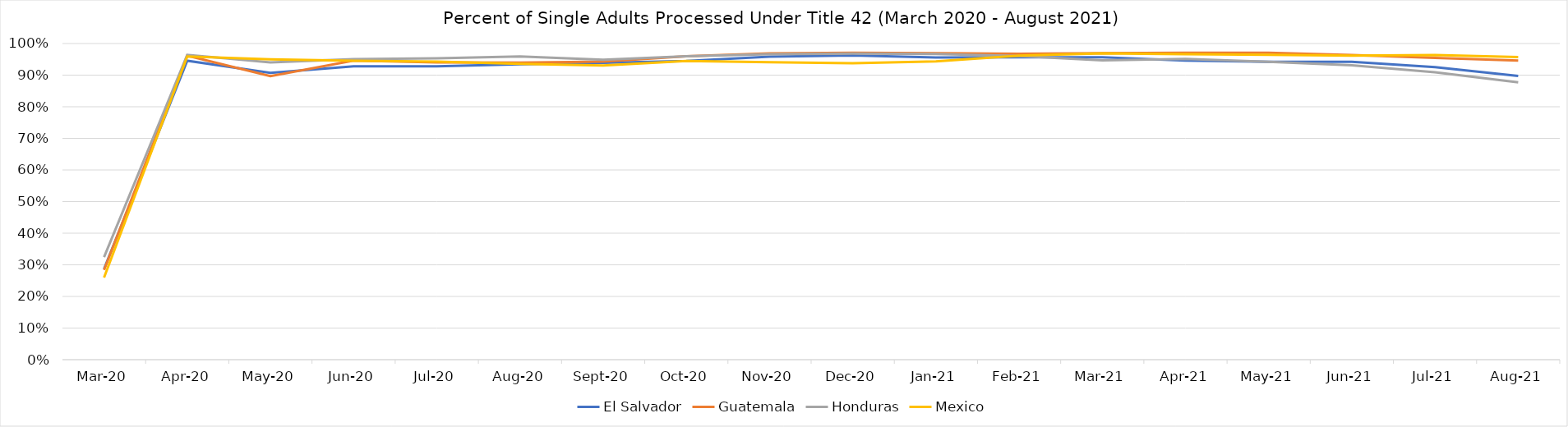
| Category | El Salvador | Guatemala | Honduras | Mexico |
|---|---|---|---|---|
| 2020-03-01 | 0.287 | 0.284 | 0.324 | 0.26 |
| 2020-04-01 | 0.946 | 0.962 | 0.964 | 0.959 |
| 2020-05-01 | 0.907 | 0.897 | 0.94 | 0.95 |
| 2020-06-01 | 0.928 | 0.946 | 0.951 | 0.946 |
| 2020-07-01 | 0.928 | 0.94 | 0.953 | 0.943 |
| 2020-08-01 | 0.934 | 0.94 | 0.959 | 0.936 |
| 2020-09-01 | 0.939 | 0.943 | 0.949 | 0.931 |
| 2020-10-01 | 0.945 | 0.96 | 0.96 | 0.945 |
| 2020-11-01 | 0.959 | 0.969 | 0.966 | 0.941 |
| 2020-12-01 | 0.962 | 0.97 | 0.968 | 0.938 |
| 2021-01-01 | 0.956 | 0.969 | 0.967 | 0.943 |
| 2021-02-01 | 0.956 | 0.968 | 0.96 | 0.962 |
| 2021-03-01 | 0.957 | 0.97 | 0.947 | 0.969 |
| 2021-04-01 | 0.946 | 0.971 | 0.951 | 0.966 |
| 2021-05-01 | 0.942 | 0.971 | 0.942 | 0.964 |
| 2021-06-01 | 0.942 | 0.964 | 0.931 | 0.962 |
| 2021-07-01 | 0.925 | 0.955 | 0.909 | 0.964 |
| 2021-08-01 | 0.897 | 0.946 | 0.877 | 0.957 |